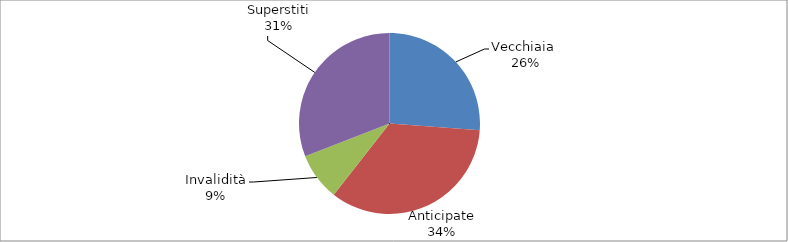
| Category | Series 0 |
|---|---|
| Vecchiaia  | 42131 |
| Anticipate | 55292 |
| Invalidità | 13706 |
| Superstiti | 49727 |